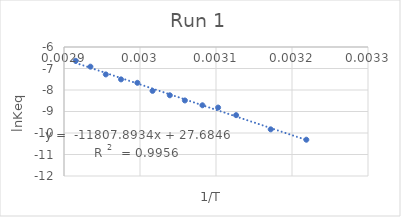
| Category | Series 0 |
|---|---|
| 0.0032188495831589788 | -10.312 |
| 0.003171985028230667 | -9.83 |
| 0.0031264655307175235 | -9.17 |
| 0.003102795618852586 | -8.817 |
| 0.0030821390044691015 | -8.711 |
| 0.003059039461609055 | -8.487 |
| 0.0030392365437802026 | -8.245 |
| 0.0030165002564025217 | -8.041 |
| 0.002996524032122737 | -7.666 |
| 0.0029750394192723053 | -7.506 |
| 0.002954995419757099 | -7.276 |
| 0.0029347889886717146 | -6.915 |
| 0.0029154518950437317 | -6.643 |